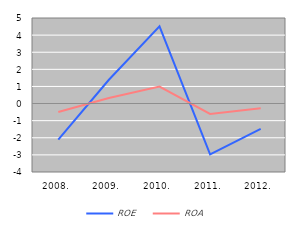
| Category | ROE | ROA |
|---|---|---|
| 2008. | -2.11 | -0.496 |
| 2009. | 1.39 | 0.32 |
| 2010. | 4.51 | 0.993 |
| 2011. | -2.97 | -0.606 |
| 2012. | -1.48 | -0.276 |